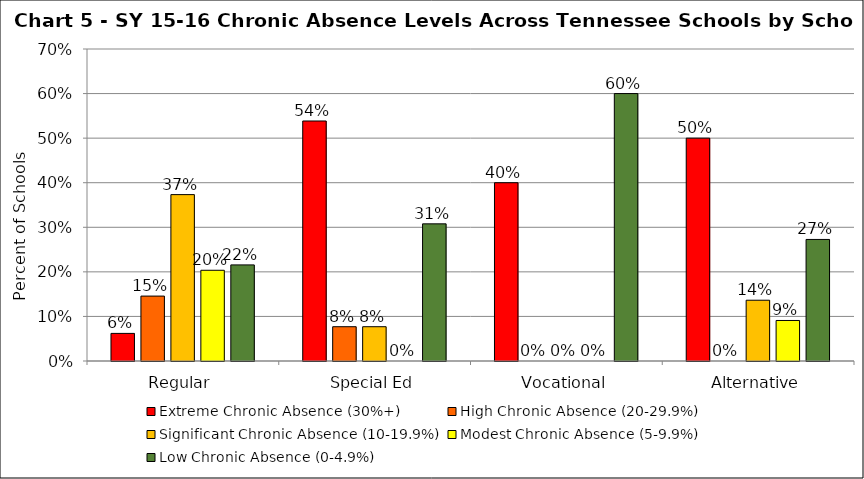
| Category | Extreme Chronic Absence (30%+) | High Chronic Absence (20-29.9%) | Significant Chronic Absence (10-19.9%) | Modest Chronic Absence (5-9.9%) | Low Chronic Absence (0-4.9%) |
|---|---|---|---|---|---|
| 0 | 0.062 | 0.146 | 0.373 | 0.204 | 0.216 |
| 1 | 0.538 | 0.077 | 0.077 | 0 | 0.308 |
| 2 | 0.4 | 0 | 0 | 0 | 0.6 |
| 3 | 0.5 | 0 | 0.136 | 0.091 | 0.273 |